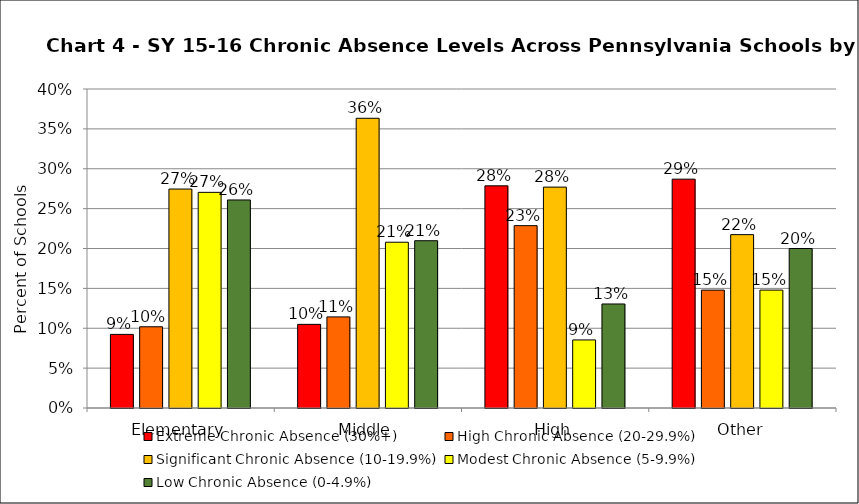
| Category | Extreme Chronic Absence (30%+) | High Chronic Absence (20-29.9%) | Significant Chronic Absence (10-19.9%) | Modest Chronic Absence (5-9.9%) | Low Chronic Absence (0-4.9%) |
|---|---|---|---|---|---|
| 0 | 0.092 | 0.102 | 0.275 | 0.27 | 0.261 |
| 1 | 0.105 | 0.114 | 0.363 | 0.208 | 0.21 |
| 2 | 0.279 | 0.229 | 0.277 | 0.085 | 0.13 |
| 3 | 0.287 | 0.148 | 0.217 | 0.148 | 0.2 |